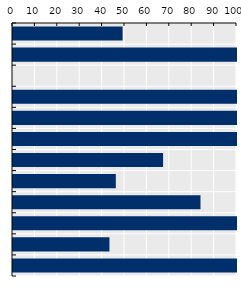
| Category | Payment rate (%) |
|---|---|
| New Zealand | 48.929 |
| Viet Nam* | 100 |
| OECD average | 0 |
| Mongolia | 100 |
| Singapore | 100 |
| China* | 100 |
| Japan | 67 |
| Thailand* | 45.9 |
| Korea | 83.7 |
| Malaysia | 100 |
| Australia | 43.054 |
| Indonesia* | 100 |